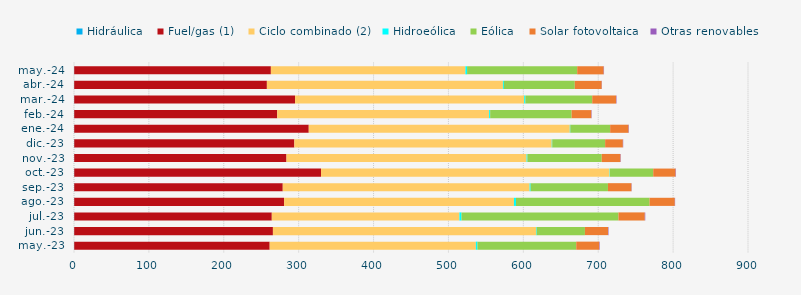
| Category | Hidráulica | Fuel/gas (1) | Ciclo combinado (2) | Hidroeólica | Eólica | Solar fotovoltaica | Otras renovables |
|---|---|---|---|---|---|---|---|
| may.-23 | 0.298 | 261.008 | 275.341 | 2.067 | 131.928 | 30.799 | 0.651 |
| jun.-23 | 0.284 | 265.329 | 351.459 | 0.809 | 64.375 | 30.793 | 0.665 |
| jul.-23 | 0.302 | 263.817 | 250.521 | 2.759 | 209.602 | 35.179 | 0.646 |
| ago.-23 | 0.29 | 280.25 | 306.931 | 2.7 | 178.405 | 33.708 | 0.375 |
| sep.-23 | 0.289 | 278.469 | 329.651 | 1.315 | 103.256 | 31.407 | 0.372 |
| oct.-23 | 0.303 | 329.555 | 385.374 | 0.443 | 57.76 | 29.906 | 0.525 |
| nov.-23 | 0.28 | 283.46 | 320.608 | 1.09 | 99.231 | 25.098 | 0.425 |
| dic.-23 | 0.306 | 293.933 | 343.705 | 0.669 | 70.608 | 23.683 | 0.445 |
| ene.-24 | 0.296 | 313.174 | 348.608 | 0.668 | 53.195 | 24.559 | 0.5 |
| feb.-24 | 0.285 | 271.078 | 282.957 | 1.415 | 108.752 | 26.307 | 0.499 |
| mar.-24 | 0.273 | 294.882 | 305.967 | 1.589 | 89.282 | 31.906 | 0.578 |
| abr.-24 | 0.258 | 257.299 | 315.195 | 1.295 | 94.672 | 35.954 | 0.264 |
| may.-24 | 0.282 | 262.61 | 259.748 | 2.252 | 147.019 | 35.421 | 0.431 |